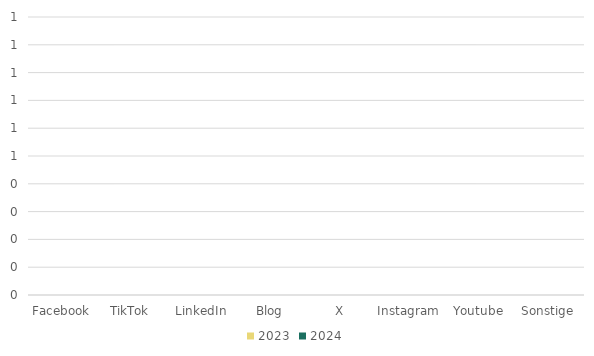
| Category | 2023 | 2024 |
|---|---|---|
| Facebook | 0 | 0 |
| TikTok | 0 | 0 |
| LinkedIn | 0 | 0 |
| Blog | 0 | 0 |
| X | 0 | 0 |
| Instagram | 0 | 0 |
| Youtube | 0 | 0 |
| Sonstige | 0 | 0 |